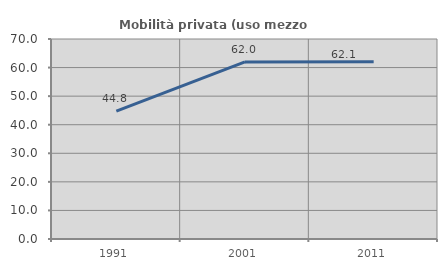
| Category | Mobilità privata (uso mezzo privato) |
|---|---|
| 1991.0 | 44.782 |
| 2001.0 | 61.987 |
| 2011.0 | 62.065 |